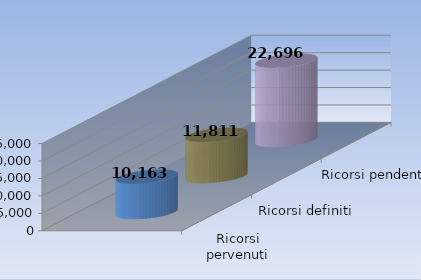
| Category | Ricorsi pervenuti | Ricorsi definiti | Ricorsi pendenti |
|---|---|---|---|
| 0 | 10163 | 11811 | 22696 |